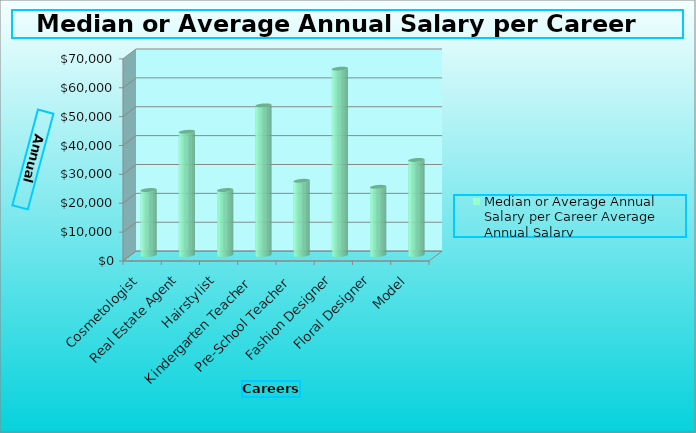
| Category | Median or Average Annual Salary per Career Average Annual Salary |
|---|---|
| Cosmetologist | 22500 |
| Real Estate Agent | 42680 |
| Hairstylist | 22500 |
| Kindergarten Teacher | 51830 |
| Pre-School Teacher | 25700 |
| Fashion Designer | 64530 |
| Floral Designer | 23610 |
| Model | 32920 |